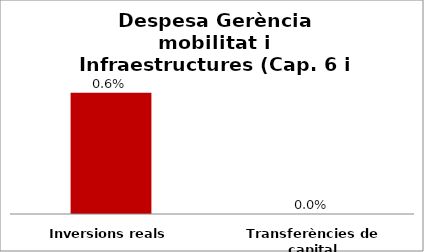
| Category | Series 0 |
|---|---|
| Inversions reals | 0.006 |
| Transferències de capital | 0 |